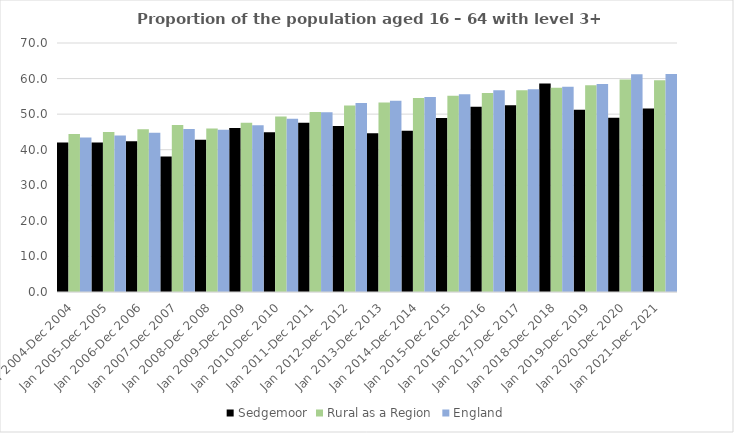
| Category | Sedgemoor | Rural as a Region | England |
|---|---|---|---|
| Jan 2004-Dec 2004 | 42 | 44.405 | 43.4 |
| Jan 2005-Dec 2005 | 42 | 44.973 | 44 |
| Jan 2006-Dec 2006 | 42.4 | 45.774 | 44.8 |
| Jan 2007-Dec 2007 | 38.1 | 46.968 | 45.8 |
| Jan 2008-Dec 2008 | 42.8 | 45.964 | 45.6 |
| Jan 2009-Dec 2009 | 46.1 | 47.59 | 46.9 |
| Jan 2010-Dec 2010 | 44.9 | 49.362 | 48.7 |
| Jan 2011-Dec 2011 | 47.6 | 50.602 | 50.5 |
| Jan 2012-Dec 2012 | 46.7 | 52.439 | 53.1 |
| Jan 2013-Dec 2013 | 44.6 | 53.276 | 53.8 |
| Jan 2014-Dec 2014 | 45.3 | 54.57 | 54.8 |
| Jan 2015-Dec 2015 | 48.9 | 55.16 | 55.6 |
| Jan 2016-Dec 2016 | 52.1 | 55.941 | 56.7 |
| Jan 2017-Dec 2017 | 52.5 | 56.689 | 57 |
| Jan 2018-Dec 2018 | 58.6 | 57.389 | 57.7 |
| Jan 2019-Dec 2019 | 51.2 | 58.147 | 58.5 |
| Jan 2020-Dec 2020 | 49 | 59.771 | 61.2 |
| Jan 2021-Dec 2021 | 51.6 | 59.54 | 61.3 |